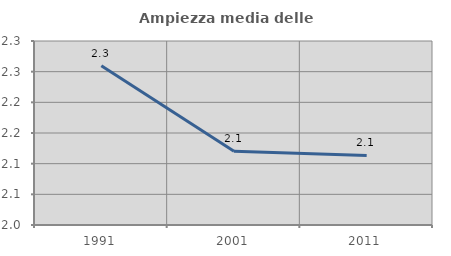
| Category | Ampiezza media delle famiglie |
|---|---|
| 1991.0 | 2.26 |
| 2001.0 | 2.12 |
| 2011.0 | 2.113 |